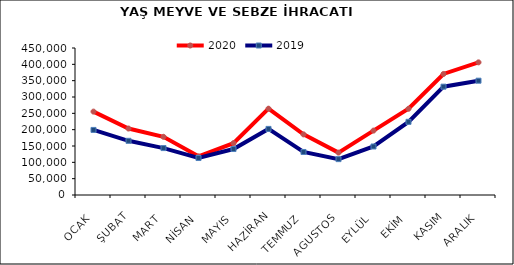
| Category | 2020 | 2019 |
|---|---|---|
| OCAK | 255294.699 | 199171.081 |
| ŞUBAT | 203439.251 | 165878.05 |
| MART | 178169.957 | 143609.007 |
| NİSAN | 118367.241 | 113212.844 |
| MAYIS | 158687.473 | 140744.813 |
| HAZİRAN | 264193.628 | 202356.848 |
| TEMMUZ | 185581.341 | 131692.405 |
| AGUSTOS | 129782.363 | 109799.824 |
| EYLÜL | 197124.894 | 148472.878 |
| EKİM | 263947.878 | 223947.975 |
| KASIM | 370532.827 | 331627.445 |
| ARALIK | 406064.638 | 349911.566 |